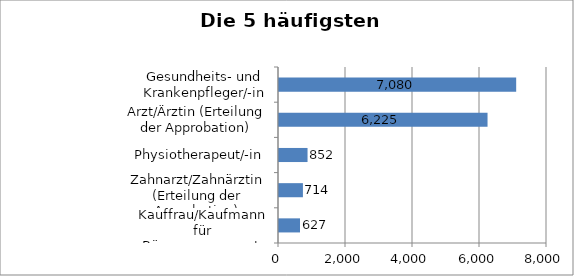
| Category | Series 0 |
|---|---|
| Kauffrau/Kaufmann für Büromanagement | 627 |
| Zahnarzt/Zahnärztin (Erteilung der Approbation) | 714 |
| Physiotherapeut/-in | 852 |
| Arzt/Ärztin (Erteilung der Approbation) | 6225 |
| Gesundheits- und Krankenpfleger/-in | 7080 |